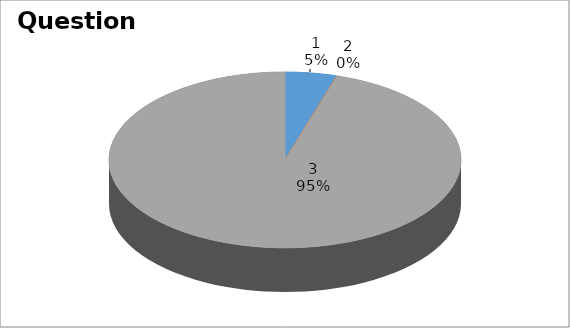
| Category | Series 0 |
|---|---|
| 0 | 1 |
| 1 | 0 |
| 2 | 20 |